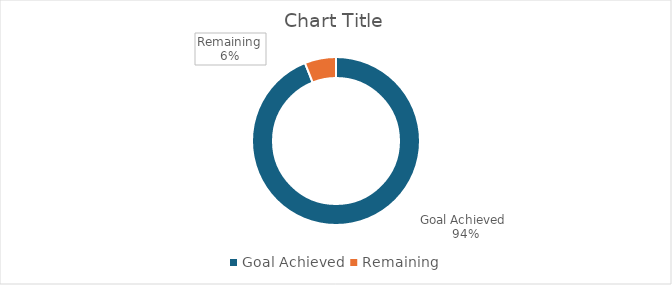
| Category | Series 0 |
|---|---|
| Goal Achieved  | 0.94 |
| Remaining | 0.06 |